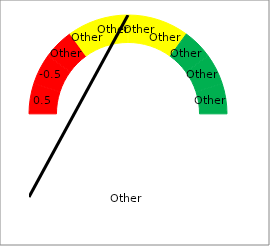
| Category | Series 0 |
|---|---|
| 0 | 0 |
|  | 1 |
|  | 0 |
|  | 1 |
|  | 0 |
|  | 1 |
| 300 | 0 |
|  | 1 |
|  | 0 |
|  | 1 |
|  | 0 |
|  | 1 |
|  | 0 |
|  | 1 |
| 500 | 0 |
|  | 1 |
|  | 0 |
|  | 1 |
|  | 0 |
|  | 1 |
| 770 | 0 |